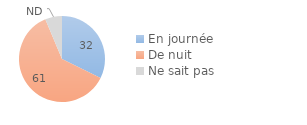
| Category | Series 0 |
|---|---|
| En journée | 32.3 |
| De nuit | 61.362 |
| Ne sait pas | 6.338 |